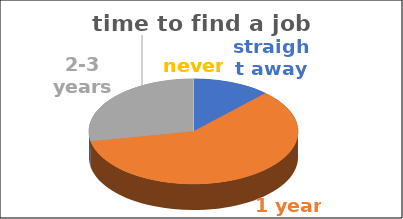
| Category | time to find a job | Series 1 | Series 2 | Series 3 | Series 4 |
|---|---|---|---|---|---|
| straight away | 0.12 |  |  |  |  |
| 1 year | 0.6 |  |  |  |  |
| 2-3 years | 0.28 |  |  |  |  |
| never | 0 |  |  |  |  |